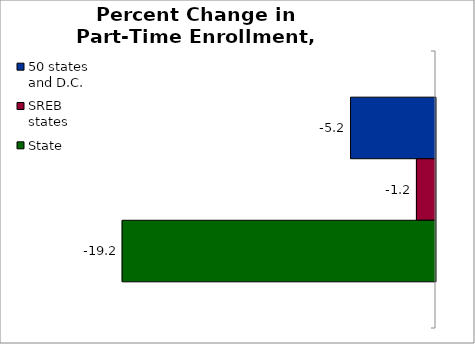
| Category | 50 states and D.C. | SREB states | State |
|---|---|---|---|
| 0 | -5.205 | -1.169 | -19.203 |